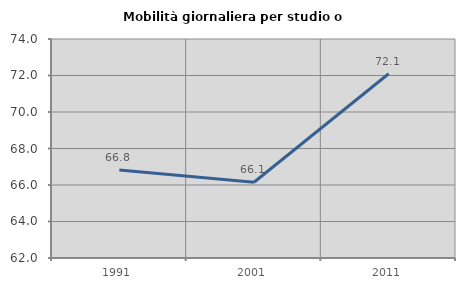
| Category | Mobilità giornaliera per studio o lavoro |
|---|---|
| 1991.0 | 66.818 |
| 2001.0 | 66.15 |
| 2011.0 | 72.095 |